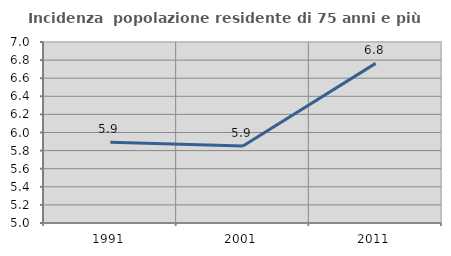
| Category | Incidenza  popolazione residente di 75 anni e più |
|---|---|
| 1991.0 | 5.891 |
| 2001.0 | 5.851 |
| 2011.0 | 6.764 |